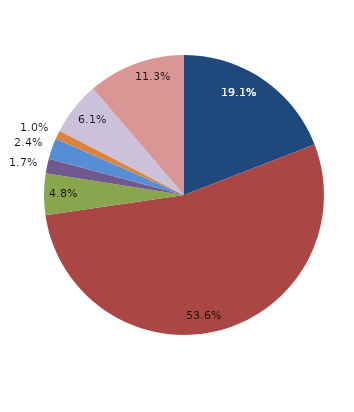
| Category | Series 0 |
|---|---|
| قبل الدخول
Before Consummation | 19.113 |
| -1 | 53.584 |
| 1 | 4.778 |
| 2 | 1.706 |
| 3 | 2.389 |
| 4 | 1.024 |
|  5 - 9 | 6.143 |
| 10+ | 11.263 |